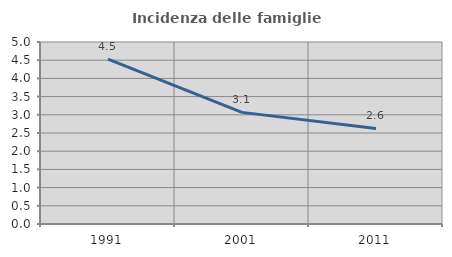
| Category | Incidenza delle famiglie numerose |
|---|---|
| 1991.0 | 4.529 |
| 2001.0 | 3.067 |
| 2011.0 | 2.624 |